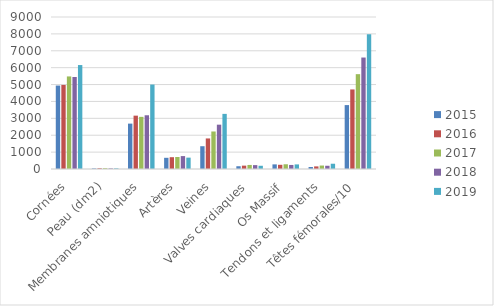
| Category | 2015 | 2016 | 2017 | 2018 | 2019 |
|---|---|---|---|---|---|
| Cornées | 4941 | 4979 | 5481 | 5448 | 6155 |
| Peau (dm2) | 33 | 45.4 | 49.1 | 36 | 40 |
| Membranes amniotiques | 2687 | 3159 | 3088 | 3182 | 5001 |
| Artères | 663 | 699 | 712 | 764 | 673 |
| Veines | 1349 | 1809 | 2221 | 2625 | 3264 |
| Valves cardiaques | 164 | 199 | 240 | 230 | 191 |
| Os Massif | 274 | 249 | 280 | 240 | 272 |
| Tendons et ligaments | 120 | 154 | 205 | 192 | 312 |
| Têtes fémorales/10 | 3784.3 | 4710.6 | 5615.5 | 6599.9 | 7973 |